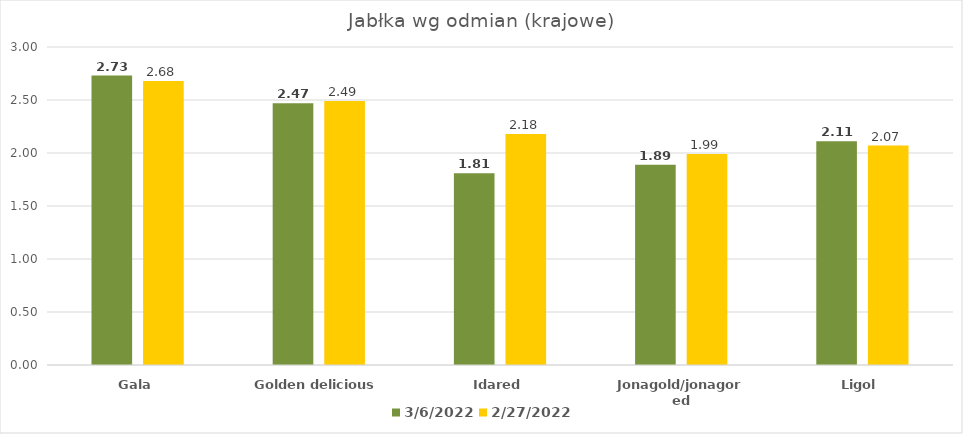
| Category | 06.03.2022 | 27.02.2022 |
|---|---|---|
| Gala | 2.73 | 2.68 |
| Golden delicious | 2.47 | 2.49 |
| Idared | 1.81 | 2.18 |
| Jonagold/jonagored | 1.89 | 1.99 |
| Ligol | 2.11 | 2.07 |